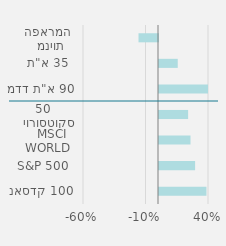
| Category | שנתי |
|---|---|
| נאסדק 100 | 0.38 |
| S&P 500 | 0.289 |
| MSCI WORLD | 0.252 |
| יורוסטוקס 50  | 0.233 |
| מדד ת"א 90 | 0.403 |
| ת"א 35 | 0.15 |
| מניות הפארמה | -0.156 |